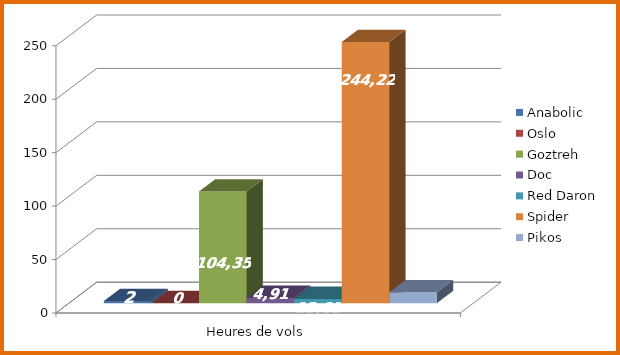
| Category | Anabolic | Oslo | Goztreh | Doc | Red Daron | Spider | Pikos |
|---|---|---|---|---|---|---|---|
| 0 | 2 | 0 | 104.35 | 4.91 | 3.96 | 244.22 | 10.25 |